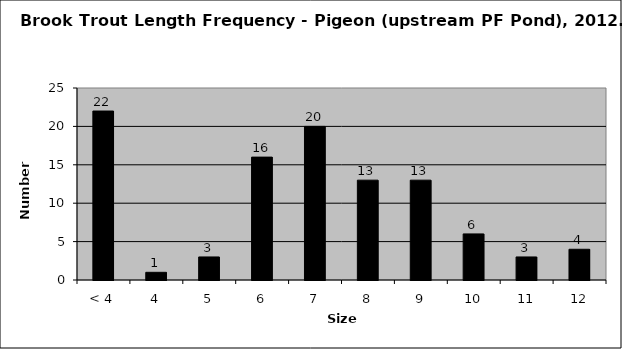
| Category | Series 0 |
|---|---|
| < 4 | 22 |
| 4 | 1 |
| 5 | 3 |
| 6 | 16 |
| 7 | 20 |
| 8 | 13 |
| 9 | 13 |
| 10 | 6 |
| 11 | 3 |
| 12 | 4 |